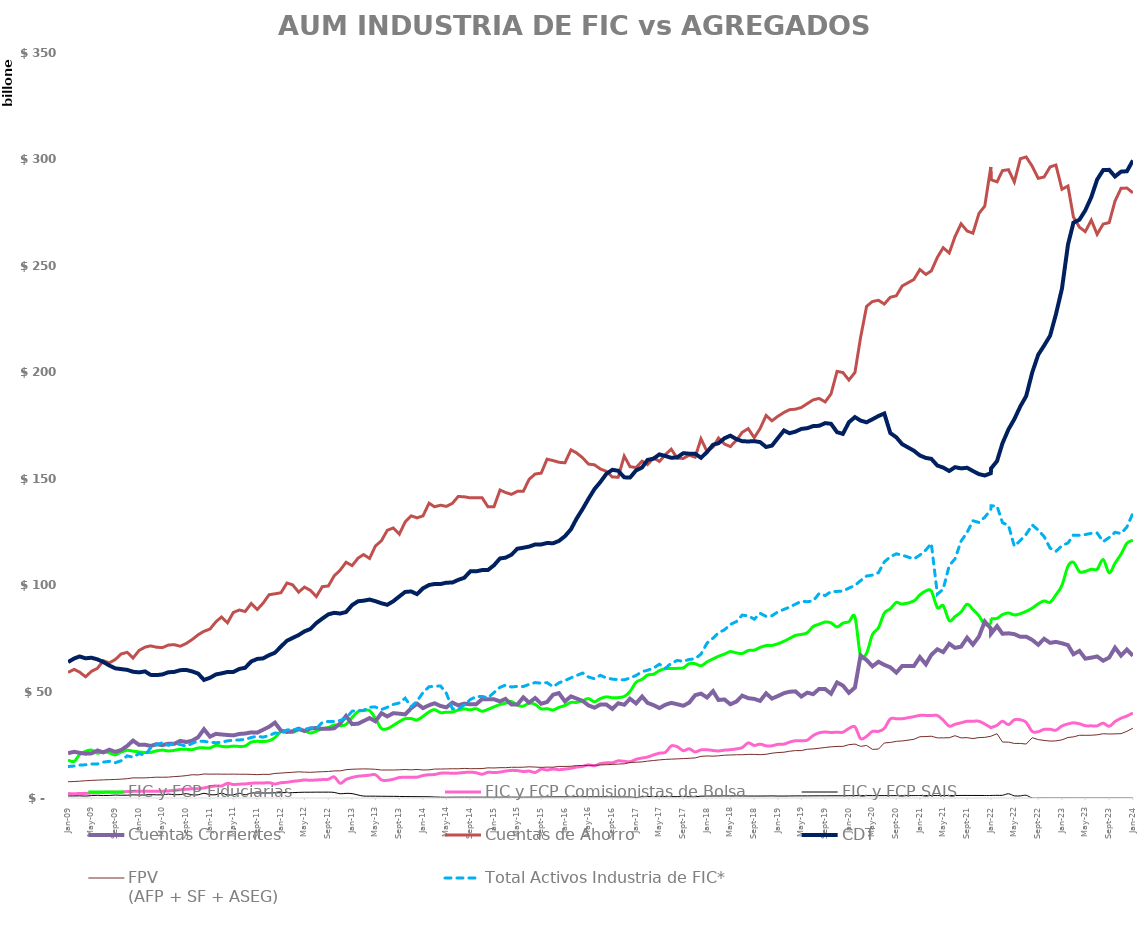
| Category | FIC y FCP Fiduciarias | FIC y FCP Comisionistas de Bolsa  | FIC y FCP SAIS | Cuentas Corrientes | Cuentas de Ahorro | CDT | FPV 
(AFP + SF + ASEG) | Total Activos Industria de FIC*  |
|---|---|---|---|---|---|---|---|---|
| 2009-01-01 | 17792239.172 | 2100542.66 | 962439.26 | 21040089.438 | 58999367.687 | 63877394.025 | 7647629.694 | 14799598.69 |
| 2009-02-01 | 17194217.152 | 1967140.68 | 956293.14 | 21714869.41 | 60405778.82 | 65534380.712 | 7751657.459 | 15018952.97 |
| 2009-03-01 | 20337363.88 | 2134644.38 | 1012448.54 | 21229406.812 | 59137277.4 | 66499801.412 | 7903642.968 | 15485046 |
| 2009-04-01 | 21958761.164 | 2138631.81 | 896627.12 | 20817553.96 | 56964966.372 | 65635299.329 | 8099376.93 | 15585961.77 |
| 2009-05-01 | 22513996.419 | 2336055.3 | 1121578.42 | 20961604.211 | 59492776.482 | 65895170.219 | 8286121.084 | 15987983.24 |
| 2009-06-01 | 21046486.068 | 2448437.58 | 1248642.13 | 22321940.134 | 60913043.271 | 65133059.461 | 8385600.015 | 15982567.83 |
| 2009-07-01 | 21871781.17 | 2623440.68 | 1149701.35 | 21420752.429 | 64486469.469 | 63910383.949 | 8522248.082 | 16854709.33 |
| 2009-08-01 | 21188789.878 | 2709594.68 | 1206713.71 | 22688223.969 | 63475807.938 | 62251898.303 | 8613906.771 | 17212421.18 |
| 2009-09-01 | 20280820.943 | 2658291.05 | 1386121.35 | 21673686.686 | 65073515.135 | 60908624.489 | 8719243.902 | 16589682.418 |
| 2009-10-01 | 21608487.093 | 2725247.27 | 1290257.29 | 22525547.45 | 67672284.07 | 60562742.887 | 8861759.81 | 17508090.928 |
| 2009-11-01 | 22396153.656 | 3044545.31 | 1317226.5 | 24455054.889 | 68440998.474 | 60197481.156 | 9068046.526 | 19801458.597 |
| 2009-12-01 | 22031134.901 | 3106700.35 | 1468565.02 | 26967356.932 | 65747994.242 | 59311640.164 | 9469304.205 | 19175772.005 |
| 2010-01-01 | 21639369.678 | 3179311.49 | 1383329.28 | 24954039.431 | 69305725.954 | 59022895.072 | 9433451.602 | 20855221.092 |
| 2010-02-01 | 21372785.209 | 3169119.85 | 1423495.84 | 25049574.137 | 70880759.204 | 59472247.066 | 9452309.941 | 20117650.972 |
| 2010-03-01 | 21434402.584 | 3174174.41 | 1594227.95 | 24420636.902 | 71469459.614 | 57851242.755 | 9611509.694 | 23484456.8 |
| 2010-04-01 | 22143243.751 | 3212727.75 | 1475837.14 | 25301982.328 | 70847211.96 | 57735039.025 | 9778654.214 | 24994020.094 |
| 2010-05-01 | 22503307.867 | 3190200.84 | 1483983.1 | 24812065.229 | 70645167.236 | 58048404.335 | 9744618.09 | 25971630.139 |
| 2010-06-01 | 22108087.545 | 3329038.91 | 1824933.45 | 25526414.201 | 71856536.453 | 59077438.758 | 9809143.264 | 24743565.778 |
| 2010-07-01 | 22375035.018 | 3572124.43 | 1568907.5 | 25422219.387 | 72032667.79 | 59235603.294 | 10060626.167 | 25644923.2 |
| 2010-08-01 | 22916586.47 | 3900515.32 | 1614182.63 | 26846242.145 | 71298447.382 | 60053578.291 | 10224850.699 | 25105098.268 |
| 2010-09-01 | 22872109.022 | 4099833.03 | 2037298.42 | 26290119.128 | 72611229.804 | 60156407.545 | 10513688.388 | 24325233.343 |
| 2010-10-01 | 22738234.3 | 4334389.78 | 1510252.83 | 26915819.282 | 74425012.581 | 59484867.202 | 10923089.827 | 25623991.653 |
| 2010-11-01 | 23509021.497 | 4340862.77 | 1483729.95 | 28542298.222 | 76665094.553 | 58441211.555 | 10834942.436 | 26757925.466 |
| 2010-12-01 | 23562424.684 | 4742999.64 | 2220193.91 | 32321078.595 | 78306142.612 | 55481322.699 | 11287314.204 | 26606400.271 |
| 2011-01-01 | 23495462.935 | 5289330.33 | 1556608.79 | 28820282.353 | 79376902.142 | 56468354.569 | 11207478.664 | 26202010.448 |
| 2011-02-01 | 24756664.566 | 5671618.52 | 1557593.58 | 30139906.351 | 82855125.664 | 58066057.51 | 11241368.84 | 25965400.899 |
| 2011-03-01 | 24274171.983 | 5632171 | 2217657.92 | 29838743.535 | 85010576 | 58536112.765 | 11202074.386 | 26202804.944 |
| 2011-04-01 | 24079345.463 | 6874755.37 | 1459776.52 | 29601505.07 | 82318818.989 | 59218987.736 | 11186753.753 | 26831808.641 |
| 2011-05-01 | 24377123.84 | 6341089.37 | 1476727.22 | 29409468.572 | 87172125.694 | 59206285.34 | 11220777.412 | 27177491.807 |
| 2011-06-01 | 24231078.42 | 6497028.02 | 2208092.5 | 30092330.237 | 88317380.74 | 60632244.817 | 11151147.79 | 27262059.905 |
| 2011-07-01 | 24434485.473 | 6608224.15 | 1531324.1 | 30282648.215 | 87627158.97 | 61184870.919 | 11176095.923 | 27516066.948 |
| 2011-08-01 | 26259447.52 | 6935490.17 | 2337915.55 | 30841103.551 | 91374682.8 | 64138804.274 | 11105936.296 | 28431284.42 |
| 2011-09-01 | 26623402.24 | 7041608 | 2322454.44 | 30699988.434 | 88529234.728 | 65335826.716 | 10964113.148 | 29009240.472 |
| 2011-10-01 | 26508006.996 | 7048002.36 | 2350293.45 | 32047983.66 | 91517505.226 | 65586962.022 | 11133132.15 | 28582876.91 |
| 2011-11-01 | 26909737.637 | 7192733.79 | 2342058.33 | 33456111.369 | 95502293.755 | 67109432.547 | 11074843.165 | 29333614.217 |
| 2011-12-01 | 28364982 | 6564786 | 2446719 | 35393548 | 95919744 | 68235861 | 11546595.74 | 30525618.234 |
| 2012-01-01 | 31131719 | 7180505 | 2478839 | 31668037.398 | 96429813.54 | 71134244.387 | 11708431.684 | 30341402.055 |
| 2012-02-01 | 31147275 | 7394169 | 2567975 | 31007469.335 | 101002712.63 | 73897067.082 | 11919293.346 | 31985876.666 |
| 2012-03-01 | 30833181 | 7823743 | 2510077 | 31372893 | 100150619 | 75192619 | 12082910.478 | 32124000.903 |
| 2012-04-01 | 31932047.65 | 8092229 | 2636558 | 32563742.234 | 96711407.203 | 76553414.137 | 12289106.986 | 32413877.353 |
| 2012-05-01 | 31562405.39 | 8467811 | 2716675 | 31445716.846 | 99087467.96 | 78272819.151 | 12156412.148 | 32194940.43 |
| 2012-06-01 | 30524721 | 8309508 | 2714337 | 32652205 | 97535090 | 79427656 | 12058126.88 | 32936198.94 |
| 2012-07-01 | 31384745 | 8476043 | 2753609 | 32914215.201 | 94633321.372 | 82178131.299 | 12231491.476 | 32574033.723 |
| 2012-08-01 | 32556264.125 | 8636341.39 | 2741827.01 | 32473082.673 | 99284188.863 | 84293159.574 | 12345156.611 | 35532853.24 |
| 2012-09-01 | 33120247 | 8786891 | 2754338 | 32485301.148 | 99622220.756 | 86273608.494 | 12470152.972 | 35987464.68 |
| 2012-10-01 | 34338711 | 9924835 | 2621952 | 32757672.42 | 104358590.858 | 87001274.106 | 12720740.166 | 35906302.806 |
| 2012-11-01 | 33938618 | 6897363 | 1988330 | 35055250.43 | 107111414.949 | 86660359.79 | 12745871.11 | 36444529.757 |
| 2012-12-01 | 34561616 | 8728627 | 2179791 | 38535455.952 | 110750588.805 | 87369641.716 | 13299299.104 | 37376487 |
| 2013-01-01 | 37836891 | 9651351 | 2068186 | 34709885.184 | 109182797.981 | 90615049.292 | 13509250.551 | 40791063 |
| 2013-02-01 | 40632956.33 | 10231474 | 1400201 | 34899680.619 | 112707815.094 | 92434040.154 | 13607848.915 | 41109419 |
| 2013-03-01 | 41069868 | 10463859 | 912927 | 36164862.111 | 114356257.363 | 92680012.269 | 13671877.605 | 41167001 |
| 2013-04-01 | 41043734 | 10736529 | 867910 | 37556322.05 | 112533114.733 | 93226256.238 | 13626257.475 | 42660834.65 |
| 2013-05-01 | 37372662.65 | 10950463 | 857331 | 36017787.759 | 118386119.194 | 92468633.061 | 13484574.137 | 42746891.39 |
| 2013-06-01 | 32613179 | 8493261 | 808179 | 39842306.408 | 120861072.922 | 91484124.39 | 13139969.891 | 41548566 |
| 2013-07-01 | 32539415 | 8294683 | 794522 | 38314923.667 | 125752507.028 | 90763716.528 | 13164680.049 | 42614397 |
| 2013-08-01 | 34114942.963 | 8807642.89 | 778363.4 | 39857916.017 | 126871339.693 | 92441495.764 | 13138412.03 | 43934432.525 |
| 2013-09-01 | 35884012 | 9612656 | 733729 | 39603634.773 | 123946270.663 | 94694686.716 | 13248237.194 | 44661476 |
| 2013-10-01 | 37250894 | 9715070 | 678939 | 39272659.973 | 129674911.513 | 96800721.471 | 13368711.223 | 46885498 |
| 2013-11-01 | 37318372.93 | 9735967.95 | 660905.93 | 42179693.943 | 132565745.258 | 97042379.372 | 13213562.109 | 42824311 |
| 2013-12-01 | 36647206.822 | 9781706.51 | 627244.94 | 44300089.672 | 131616929.6 | 95773066.764 | 13412280.346 | 45470034 |
| 2014-01-01 | 38369903.334 | 10557268.53 | 595392.99 | 42230304 | 132558811 | 98518081 | 13141330.376 | 49556428 |
| 2014-02-01 | 40449101.764 | 10954202.7 | 588536.56 | 43599724.41 | 138509031.454 | 100065132.396 | 13233550.635 | 52264631.33 |
| 2014-03-01 | 41519630.114 | 11027301.95 | 470068.23 | 44500844.044 | 136817273.962 | 100541868.899 | 13584518.658 | 52446654 |
| 2014-04-01 | 40116498 | 11657872 | 385729 | 43231698.1 | 137554847.305 | 100516933.788 | 13615476.315 | 52648173 |
| 2014-05-01 | 40315151.32 | 11776989.97 | 345001.78 | 42585585.256 | 137008074.28 | 101154120.942 | 13660673.832 | 49180456.65 |
| 2014-06-01 | 40416098.89 | 11579961.3 | 371228.88 | 44817124.428 | 138429028.965 | 101220614.506 | 13743144.418 | 41914619 |
| 2014-07-01 | 41316797 | 11715729 | 375325 | 43521000 | 141652000 | 102464000 | 13715305.865 | 41628620 |
| 2014-08-01 | 41855731.708 | 11985721.68 | 391319.12 | 44347000 | 141508000 | 103457000 | 13905242.744 | 43700949.253 |
| 2014-09-01 | 41411891.289 | 12137558.48 | 380927.6 | 44025212.782 | 141003775.677 | 106475441.817 | 13762483.464 | 46230397 |
| 2014-10-01 | 41975634 | 11856857 | 377516 | 44025212.782 | 141003775.677 | 106475441.817 | 13795830.272 | 47644903 |
| 2014-11-01 | 40740001.671 | 11158123 | 368897 | 46462368.859 | 141050657.705 | 107070411.692 | 13829598.92 | 47715246.81 |
| 2014-12-01 | 41656654.292 | 12075430.7 | 368901.58 | 46381000 | 136815000 | 107117082.017 | 14167694.014 | 47056158.272 |
| 2015-01-01 | 42829367 | 11943981 | 361106 | 46380640.852 | 136815012.002 | 109331074.058 | 14105770.897 | 49522564.854 |
| 2015-02-01 | 43906014 | 12174662 | 377946 | 45389931.566 | 144696890.023 | 112547249.862 | 14245271.387 | 51991841.024 |
| 2015-03-01 | 44527590 | 12624685 | 373755 | 46556394.03 | 143546680.679 | 112885686.92 | 14238413.855 | 53017000.294 |
| 2015-04-01 | 45347838 | 12968209 | 400026 | 43882131.877 | 142640978.203 | 114295912.468 | 14432998.432 | 52160099 |
| 2015-05-01 | 43602206.437 | 12870169 | 379934 | 43868330.885 | 144067660.411 | 117095747.48 | 14423377.487 | 52437143.07 |
| 2015-06-01 | 43184659.116 | 12456297 | 378882 | 47269216.705 | 144099449.315 | 117576199.725 | 14467508.121 | 52367289.07 |
| 2015-07-01 | 44614821.846 | 12629777 | 394228 | 44824893.119 | 149762182.064 | 118118438.808 | 14663702.588 | 53407851 |
| 2015-08-01 | 43989076.157 | 12009130 | 397232 | 46961211.638 | 152216129.231 | 119114602.082 | 14529265.46 | 54232772.508 |
| 2015-09-01 | 41857276.437 | 13554913 | 440374 | 44277600.072 | 152612486.174 | 119116749.002 | 14379522.061 | 53930377.369 |
| 2015-10-01 | 41966985 | 13118659.51 | 501533 | 45094005.049 | 159196192.021 | 119793024.514 | 14509464.447 | 54210007 |
| 2015-11-01 | 41365255 | 13619238 | 502481 | 48513369.195 | 158519924.955 | 119681100.359 | 14468322.769 | 52267021.671 |
| 2015-12-01 | 42558876.345 | 13300169 | 516569 | 49285505.594 | 157725448.27 | 120756047.93 | 14848609.659 | 54100986.572 |
| 2016-01-01 | 43472183 | 13579289 | 517684 | 45368735.999 | 157475605.492 | 122975254.619 | 14825068.35 | 55134454 |
| 2016-02-01 | 44904961.572 | 13948131 | 526504 | 47744020.678 | 163541609.018 | 126254546.723 | 14915465.741 | 56458622 |
| 2016-03-01 | 44921377.27 | 14526538 | 551021 | 46707243.646 | 162117145.793 | 131244339.223 | 15223556.252 | 57526030 |
| 2016-04-01 | 45667420 | 14828090 | 550022 | 45621999.683 | 159833273.331 | 135771123.5 | 15263360.655 | 58716073 |
| 2016-05-01 | 46726726.617 | 15560816 | 551107 | 43514447.944 | 156878031.239 | 140527045.012 | 15313185.27 | 56852309.437 |
| 2016-06-01 | 45222447.609 | 15141673 | 547564 | 42434113.352 | 156521975.202 | 145130344.445 | 15357677.844 | 56019838.116 |
| 2016-07-01 | 46710606.529 | 16108722 | 553440 | 43891948.187 | 154596652.035 | 148404415.743 | 15528129.989 | 57638826.846 |
| 2016-08-01 | 47512415 | 16527322 | 562941 | 43890420.74 | 153476072.003 | 152277396.699 | 15646521.009 | 56395438.157 |
| 2016-09-01 | 47102022.877 | 16559309 | 549077 | 41863341.532 | 150778144.586 | 154187082.647 | 15773427.906 | 55852563.437 |
| 2016-10-01 | 47168514.542 | 17435641 | 460432 | 44505224.349 | 150721044.65 | 153731885.974 | 15947295.967 | 55587177.51 |
| 2016-11-01 | 47718064 | 17243897 | 464614 | 43803723.471 | 160646159.221 | 150647315.539 | 16070122.225 | 55486974 |
| 2016-12-01 | 50077108.765 | 17024827 | 481553 | 46616292.021 | 155649773.745 | 150549237.17 | 16686648.639 | 56375614.345 |
| 2017-01-01 | 54368178.505 | 18181608 | 222152 | 44442010.194 | 155244726.496 | 153886811.688 | 16818695.993 | 57569156 |
| 2017-02-01 | 55762190.181 | 18776174.177 | 579714.85 | 47657415.777 | 158251548.569 | 155310289.15 | 16972857.277 | 59379596.572 |
| 2017-03-01 | 57747289.049 | 19241862.357 | 655367.902 | 44697365.002 | 156647290.937 | 158821173.031 | 17322864.933 | 59998936.27 |
| 2017-04-01 | 58164520 | 20227683 | 641508 | 43616908.455 | 159780567.33 | 159434119.369 | 17610744.228 | 61045532 |
| 2017-05-01 | 59841564 | 21050779 | 628347 | 42239864.757 | 158115214.364 | 161414965.04 | 17897354.211 | 62838649.617 |
| 2017-06-01 | 60786454.012 | 21451129.062 | 628314.626 | 43810127.154 | 161349013.039 | 160671195.131 | 18136078.113 | 60911684.609 |
| 2017-07-01 | 60816180.783 | 24476364.089 | 632988.556 | 44691718.554 | 163885549.644 | 159803990.507 | 18261453.112 | 63372768.529 |
| 2017-08-01 | 60902525 | 24058592 | 631625 | 44054660.814 | 159638000 | 160059000 | 18386706.881 | 64602678 |
| 2017-09-01 | 61127629 | 22219060 | 673578 | 43330054.008 | 159527528.2 | 161996651.348 | 18508890.927 | 64210408.877 |
| 2017-10-01 | 63105115.683 | 23122990 | 561905 | 44789028.673 | 161040018.386 | 161758053.274 | 18651311.322 | 65064587.542 |
| 2017-11-01 | 63102535 | 21640090 | 566184 | 48308003.562 | 160113329.651 | 161726673.163 | 18839024.719 | 65426575 |
| 2017-12-01 | 62127325 | 22603730 | 875331 | 49040782.522 | 168742902.483 | 159841329.569 | 19576385.715 | 67583488.765 |
| 2018-01-01 | 63938242 | 22648623 | 879678 | 47216931.732 | 162781465.049 | 162535157.785 | 19748025.204 | 72771938.505 |
| 2018-02-01 | 65357837 | 22320847 | 950750 | 50174200.241 | 164930800.368 | 165943798.481 | 19669969.384 | 75118079.208 |
| 2018-03-01 | 66580958 | 22111577 | 954371 | 46064458.079 | 169103161.446 | 166672653.203 | 19802479.283 | 77644519.308 |
| 2018-04-01 | 67605714 | 22478848 | 983710 | 46287698.831 | 166258678.919 | 169010131.166 | 20119796.013 | 79033711 |
| 2018-05-01 | 68783686 | 22674488 | 970461 | 44034361.721 | 165106317.223 | 170232145.256 | 20203862.672 | 81520690 |
| 2018-06-01 | 68179383 | 23064433 | 977571 | 45282598.338 | 167988914.573 | 168605713.635 | 20307291.936 | 82865897.7 |
| 2018-07-01 | 67891332.876 | 23695065 | 981550 | 48090725.791 | 171789954.916 | 167623407.946 | 20321726.758 | 85925533.428 |
| 2018-08-01 | 69290394.916 | 25889867 | 916282 | 46892865.731 | 173528210.847 | 167494515.744 | 20496962.068 | 85592742 |
| 2018-09-01 | 69468408 | 24695139 | 918203 | 46545235.243 | 169253761.111 | 167650153.722 | 20484787.245 | 84020267 |
| 2018-10-01 | 70752372.545 | 25303024 | 923856 | 45619808.862 | 173540048.109 | 167193109.497 | 20349410.39 | 86790010.683 |
| 2018-11-01 | 71596777 | 24525057 | 936854 | 49168133.858 | 179733646.903 | 164906615.194 | 20551807.323 | 85308809 |
| 2018-12-01 | 71679839 | 24525616 | 982589 | 46701780.579 | 177202446.744 | 165546553.572 | 21038534.051 | 85606386 |
| 2019-01-01 | 72479982 | 25224946 | 913635 | 47919007.538 | 179357673.563 | 169137227.662 | 21352471.029 | 87466543 |
| 2019-02-01 | 73642869 | 25291314 | 915329 | 49251446.721 | 181126226.127 | 172655618.131 | 21509245.731 | 88629434 |
| 2019-03-01 | 74925058 | 26249781 | 953344 | 49915673.748 | 182418243.406 | 171353531.629 | 21952152 | 89646906 |
| 2019-04-01 | 76387191 | 26901659 | 984140 | 50098154.109 | 182670636.205 | 172132365.456 | 22277971 | 91068272 |
| 2019-05-01 | 76851157.52 | 26901659 | 984140 | 47668839.935 | 183449047.246 | 173388676.147 | 22277971 | 92428635 |
| 2019-06-01 | 77670420 | 27188020 | 990243 | 49503365.541 | 185288152.785 | 173744511.023 | 22897709 | 92221387 |
| 2019-07-01 | 80565138.336 | 29333372 | 1008806 | 48777078.865 | 187040794.645 | 174724088.504 | 23064609 | 92567947.876 |
| 2019-08-01 | 81665926 | 30619880 | 1026967 | 51259181.407 | 187718162.039 | 174863760.82 | 23392445 | 96096543.916 |
| 2019-09-01 | 82690421 | 31003788 | 1024257 | 51167798.313 | 186094828.693 | 176108385.563 | 23715691 | 95081750 |
| 2019-10-01 | 82266738 | 30781025 | 1039920 | 48995503.076 | 189857556.141 | 175798830.418 | 24030558 | 96979252.545 |
| 2019-11-01 | 80353973 | 30911689 | 1047092 | 54284893.549 | 200422018.163 | 171857691.006 | 24244735 | 97058688 |
| 2019-12-01 | 82151903.071 | 30911689 | 1047092 | 52830252.44 | 199894729.527 | 171064162.485 | 24244735 | 97188044 |
| 2020-01-01 | 82805198 | 32656201 | 1074419 | 49409711.466 | 196356438.807 | 176524939.06 | 25050286 | 98618563 |
| 2020-02-01 | 85032535 | 33436183 | 1114435 | 51895139.317 | 199894729.527 | 178952079.989 | 25329244 | 99849512 |
| 2020-03-01 | 66653380 | 27922541 | 1119686 | 66994716.314 | 216350021.864 | 177306532.246 | 24258651 | 102128183 |
| 2020-04-01 | 68067849 | 28967912 | 1128656 | 64826202.461 | 230976315.947 | 176509180.865 | 24675238 | 104272990 |
| 2020-05-01 | 76776524 | 31299813 | 1114186 | 61861996.807 | 233257059.364 | 177928893.453 | 22851890 | 104736956.52 |
| 2020-06-01 | 79968756.495 | 31299813 | 1114186 | 64007790.448 | 233812487.66 | 179459613.807 | 22959453 | 105848683 |
| 2020-07-01 | 86857765.406 | 32706648 | 1117287 | 62556185.128 | 232065276.196 | 180637653.77 | 25855140 | 110907316.336 |
| 2020-08-01 | 88878156 | 37166859 | 1101793 | 61386319.533 | 235247476.878 | 171446008.642 | 26100716 | 113312773 |
| 2020-09-01 | 91898751 | 37239433 | 1107266 | 58923624.375 | 235949000.32 | 169443256.217 | 26631590.973 | 114718466 |
| 2020-10-01 | 91114749.242 | 37239433 | 1101793 | 61998471.521 | 240542801.84 | 166235916.287 | 26793311.123 | 114087683 |
| 2020-11-30 | 92584123 | 38219130 | 1131547 | 61977035 | 243587611 | 163166379 | 27558587 | 112312754 |
| 2020-12-31 | 95450213 | 38808005 | 1152271 | 66195921 | 248280374 | 160920686 | 28795659 | 114110684.071 |
| 2021-01-31 | 97303044.111 | 38808005 | 1152271 | 62790735.364 | 245989536.536 | 159757385.722 | 28868976.482 | 116535818 |
| 2021-02-28 | 97280981 | 38742515 | 1149215 | 67260668 | 247634786 | 159332986 | 29029138 | 119583153 |
| 2021-03-31 | 89451793 | 38742515 | 1149215 | 69877997 | 253972084 | 156181634 | 28246344 | 95695607 |
| 2021-04-30 | 90366068 | 36553166 | 1141902 | 68532109.608 | 258528935.703 | 155233285.593 | 28242671 | 98164417 |
| 2021-05-31 | 83352812 | 33757308 | 1148056 | 72481341.732 | 256045714.505 | 153626033.375 | 28315857 | 109190523 |
| 2021-06-30 | 85230784 | 34621740 | 1164025 | 70538750 | 263747857 | 155424594 | 29274181 | 112382755.495 |
| 2021-07-31 | 87390617 | 35325466 | 1195078 | 71088631 | 269779754 | 154847922 | 28248227 | 120681700.406 |
| 2021-08-31 | 91055774 | 36039799 | 1206057 | 75317587 | 266382741 | 155147356 | 28354367.424 | 124740809.283 |
| 2021-09-30 | 88575238 | 36059285 | 1190377 | 72052801.93 | 265340930.653 | 153619575.115 | 27920313 | 130245450 |
| 2021-10-31 | 85601206 | 36059285 | 1190377 | 75850685.516 | 274603529.339 | 152164828.527 | 28391884.424 | 129455975.242 |
| 2021-11-30 | 81527296 | 34713637 | 1162026 | 82927635 | 278102468 | 151506502 | 28487277 | 131934800 |
| 2021-12-31 | 81558130 | 33123758 | 1173839 | 79659726.239 | 296468474.053 | 152580727 | 28998852.033 | 135410489 |
| 2022-01-01 | 84274913 | 33123758 | 1173839 | 77176000 | 290460000 | 154786000 | 28954347 | 137263320.111 |
| 2022-02-01 | 84385617 | 34154855 | 1256994 | 80752574.322 | 289480534.354 | 158286863.478 | 30196012.811 | 137172711 |
| 2022-03-01 | 86168666 | 36060892 | 1270810 | 77168000 | 294771000 | 166642000 | 26297908.519 | 129343523 |
| 2022-04-01 | 86938764 | 34478552.613 | 1988830 | 77363786.995 | 295167185.052 | 173214105.101 | 26244238 | 128061136 |
| 2022-05-01 | 85997845 | 36745837 | 1011294 | 76985654.189 | 289415413.801 | 177977654.043 | 25636461.431 | 118258176 |
| 2022-06-01 | 86591456 | 36745837 | 1011294 | 75712526.953 | 300341368.312 | 184009667.859 | 25633288.431 | 121016549 |
| 2022-07-01 | 87708022 | 35521123 | 1270545 | 75807567 | 301162159 | 188834180 | 25342433.688 | 123911161 |
| 2022-08-01 | 89195659 | 31249543 | 0 | 74260937 | 296806338 | 199925525 | 28325931 | 128301630 |
| 2022-09-01 | 91231196 | 31148966 | 0 | 71994713 | 291117220 | 208263233 | 27441357 | 125824900 |
| 2022-10-01 | 92581456 | 32259292 | 0 | 74806330 | 291744108 | 212521800 | 27048003 | 122850868 |
| 2022-11-01 | 91957234 | 32275591 | 0 | 72883433 | 296488410 | 217192227 | 26724509 | 117402959 |
| 2022-12-01 | 95442910 | 31869535 | 0 | 73341783 | 297374471 | 227242142 | 26835460 | 115855727 |
| 2023-01-01 | 99943678 | 33839185 | 0 | 72665475 | 285972969 | 239302201 | 27318716 | 118572510 |
| 2023-02-01 | 108877417 | 34809594.24 | 0 | 71821422.532 | 287511755.629 | 259956801.016 | 28423853 | 119797466 |
| 2023-03-01 | 110749120 | 35308207 | 0 | 67523380 | 272947235 | 270279142 | 28715413 | 123500368 |
| 2023-04-01 | 106344141 | 34863045 | 0 | 69111015.2 | 268163791.263 | 271677117.924 | 29466916 | 123406146.613 |
| 2023-05-01 | 106471679 | 33953999 | 0 | 65467776 | 266072841 | 276064508 | 29455534 | 123754976 |
| 2023-06-01 | 107470613 | 33893564 | 0 | 65929880.064 | 271483690.434 | 282284596.866 | 29491523 | 124348587 |
| 2023-07-01 | 107470613 | 33882937 | 0 | 66506770.639 | 264834171.467 | 290533159.15 | 29679815 | 124499690 |
| 2023-08-01 | 112042129 | 35174023 | 0 | 64483558.908 | 269638289.839 | 294984688.836 | 30199560 | 120445202 |
| 2023-09-01 | 105748824 | 33666614 | 0 | 65983867 | 270326709 | 295105809 | 30060213 | 122380162 |
| 2023-10-01 | 110307827 | 35929850 | 0 | 70636498 | 280443084 | 291982035 | 30128675 | 124840748 |
| 2023-11-01 | 114544815 | 37472940 | 0 | 66899885 | 286427341 | 294267453 | 30225410 | 124232825 |
| 2023-12-01 | 119662928 | 38509954 | 0 | 69765846 | 286554029 | 294448188 | 31334372 | 127312445 |
| 2024-01-01 | 121089200 | 39934387 | 0 | 66845985 | 284303275 | 299506523 | 32802226 | 133782863 |